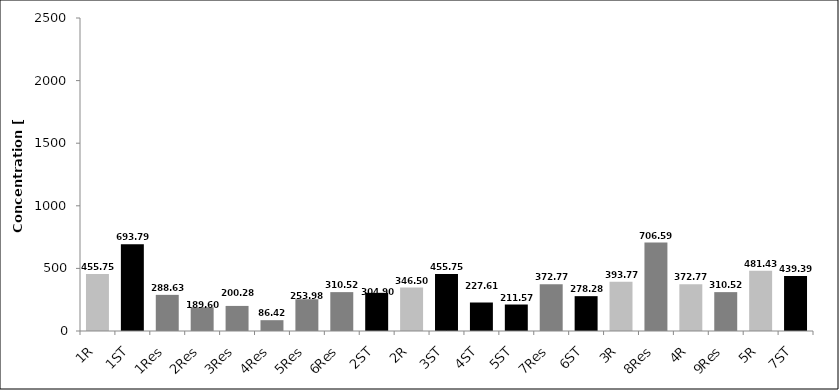
| Category | Concentrations of triclosan |
|---|---|
| 1R | 455.748 |
| 1ST | 693.795 |
| 1Res | 288.635 |
| 2Res | 189.602 |
| 3Res | 200.285 |
| 4Res | 86.424 |
| 5Res | 253.982 |
| 6Res | 310.52 |
| 2ST | 304.898 |
| 2R | 346.497 |
| 3ST | 455.748 |
| 4ST | 227.611 |
| 5ST | 211.569 |
| 7Res | 372.769 |
| 6ST | 278.278 |
| 3R | 393.772 |
| 8Res | 706.587 |
| 4R | 372.769 |
| 9Res | 310.52 |
| 5R | 481.427 |
| 7ST | 439.395 |